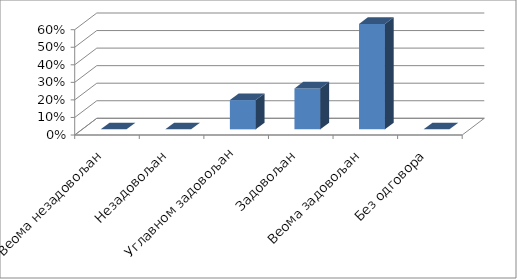
| Category | Series 0 |
|---|---|
| Веома незадовољан | 0 |
| Незадовољан | 0 |
| Углавном задовољан | 0.167 |
| Задовољан | 0.233 |
| Веома задовољан | 0.6 |
| Без одговора | 0 |